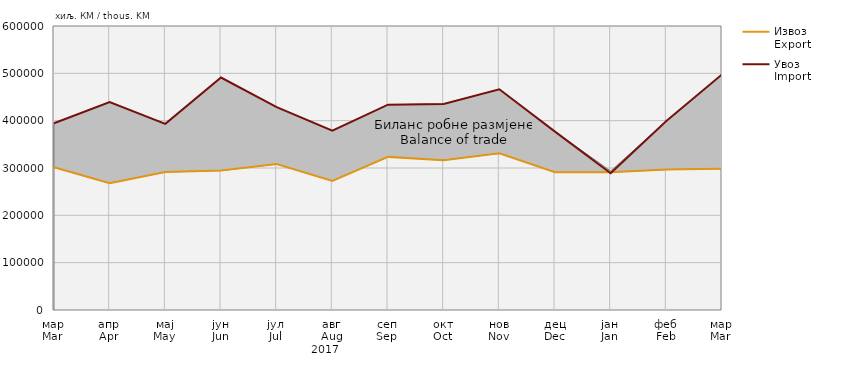
| Category | Извоз
Export | Увоз
Import |
|---|---|---|
| мар
Mar | 301409 | 394461 |
| апр
Apr | 267973 | 439231 |
| мај
May | 291490 | 393257 |
| јун
Jun | 294506 | 491152 |
| јул
Jul | 308275 | 428722 |
| авг
Aug | 272830 | 378735 |
| сеп
Sep | 323479 | 433731 |
| окт
Oct | 316474 | 435293 |
| нов
Nov | 330900 | 466301 |
| дец
Dec | 291210 | 376925 |
| јан
Jan | 291239 | 288860 |
| феб
Feb | 296672 | 399118 |
| мар
Mar | 298559 | 497736 |